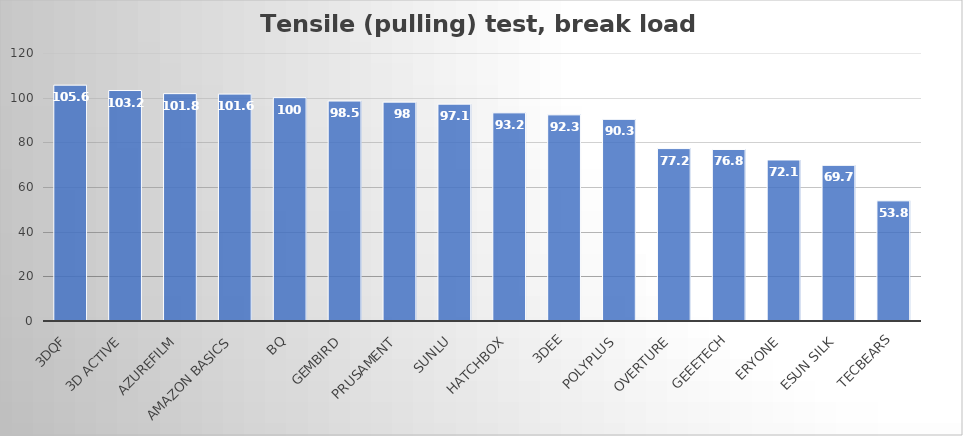
| Category | Average |
|---|---|
| 3DQF | 105.6 |
| 3D Active | 103.2 |
| AzureFilm | 101.8 |
| Amazon Basics | 101.6 |
| BQ | 100 |
| Gembird | 98.5 |
| Prusament | 98 |
| Sunlu | 97.1 |
| Hatchbox | 93.2 |
| 3Dee | 92.3 |
| PolyPlus | 90.3 |
| Overture | 77.2 |
| Geeetech | 76.8 |
| Eryone | 72.1 |
| eSun Silk | 69.7 |
| TecBears | 53.8 |